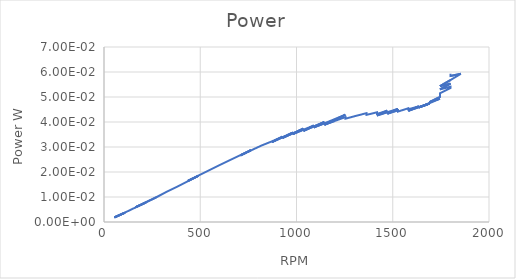
| Category | Series 0 |
|---|---|
| 54.0 | 0.002 |
| 109.0 | 0.004 |
| 54.0 | 0.002 |
| 109.0 | 0.004 |
| 109.0 | 0.004 |
| 163.0 | 0.006 |
| 218.0 | 0.008 |
| 163.0 | 0.006 |
| 272.0 | 0.01 |
| 272.0 | 0.01 |
| 272.0 | 0.01 |
| 327.0 | 0.012 |
| 381.0 | 0.014 |
| 381.0 | 0.014 |
| 381.0 | 0.014 |
| 490.0 | 0.018 |
| 436.0 | 0.016 |
| 490.0 | 0.019 |
| 545.0 | 0.021 |
| 545.0 | 0.021 |
| 600.0 | 0.023 |
| 600.0 | 0.023 |
| 654.0 | 0.025 |
| 654.0 | 0.025 |
| 654.0 | 0.025 |
| 763.0 | 0.029 |
| 709.0 | 0.027 |
| 763.0 | 0.029 |
| 818.0 | 0.031 |
| 818.0 | 0.03 |
| 818.0 | 0.03 |
| 872.0 | 0.032 |
| 927.0 | 0.034 |
| 872.0 | 0.032 |
| 981.0 | 0.036 |
| 927.0 | 0.034 |
| 1036.0 | 0.037 |
| 981.0 | 0.035 |
| 1036.0 | 0.037 |
| 1090.0 | 0.039 |
| 1036.0 | 0.036 |
| 1145.0 | 0.04 |
| 1090.0 | 0.038 |
| 1145.0 | 0.039 |
| 1254.0 | 0.043 |
| 1145.0 | 0.039 |
| 1200.0 | 0.04 |
| 1254.0 | 0.042 |
| 1254.0 | 0.042 |
| 1254.0 | 0.041 |
| 1254.0 | 0.041 |
| 1309.0 | 0.042 |
| 1309.0 | 0.042 |
| 1363.0 | 0.044 |
| 1363.0 | 0.043 |
| 1363.0 | 0.043 |
| 1363.0 | 0.043 |
| 1418.0 | 0.044 |
| 1418.0 | 0.044 |
| 1418.0 | 0.043 |
| 1472.0 | 0.045 |
| 1418.0 | 0.043 |
| 1472.0 | 0.044 |
| 1527.0 | 0.045 |
| 1472.0 | 0.043 |
| 1527.0 | 0.045 |
| 1527.0 | 0.044 |
| 1527.0 | 0.044 |
| 1581.0 | 0.045 |
| 1581.0 | 0.045 |
| 1581.0 | 0.045 |
| 1581.0 | 0.045 |
| 1636.0 | 0.046 |
| 1636.0 | 0.046 |
| 1581.0 | 0.044 |
| 1636.0 | 0.046 |
| 1636.0 | 0.046 |
| 1690.0 | 0.047 |
| 1636.0 | 0.046 |
| 1690.0 | 0.047 |
| 1636.0 | 0.046 |
| 1690.0 | 0.047 |
| 1690.0 | 0.048 |
| 1745.0 | 0.049 |
| 1690.0 | 0.048 |
| 1690.0 | 0.048 |
| 1745.0 | 0.05 |
| 1745.0 | 0.05 |
| 1745.0 | 0.051 |
| 1745.0 | 0.051 |
| 1745.0 | 0.051 |
| 1800.0 | 0.054 |
| 1800.0 | 0.054 |
| 1745.0 | 0.053 |
| 1800.0 | 0.055 |
| 1745.0 | 0.054 |
| 1800.0 | 0.057 |
| 1854.0 | 0.059 |
| 1800.0 | 0.058 |
| 1800.0 | 0.059 |